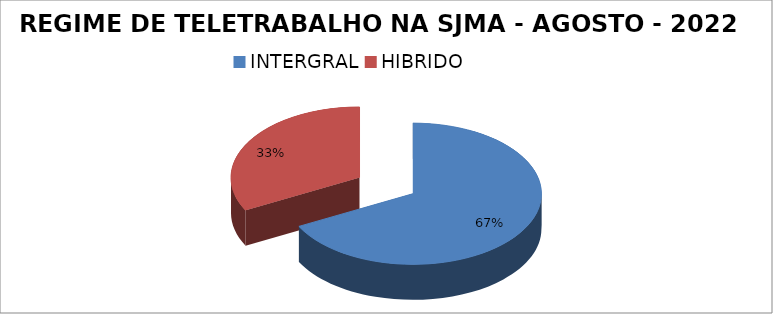
| Category | Series 0 |
|---|---|
| INTERGRAL | 66 |
| HIBRIDO | 32 |